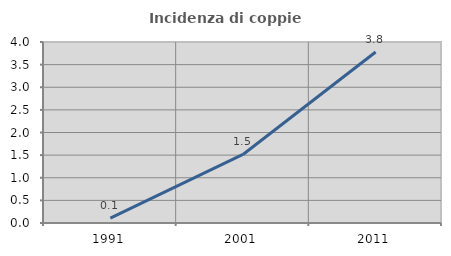
| Category | Incidenza di coppie miste |
|---|---|
| 1991.0 | 0.109 |
| 2001.0 | 1.515 |
| 2011.0 | 3.779 |